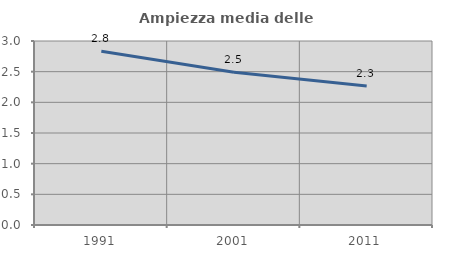
| Category | Ampiezza media delle famiglie |
|---|---|
| 1991.0 | 2.832 |
| 2001.0 | 2.489 |
| 2011.0 | 2.268 |